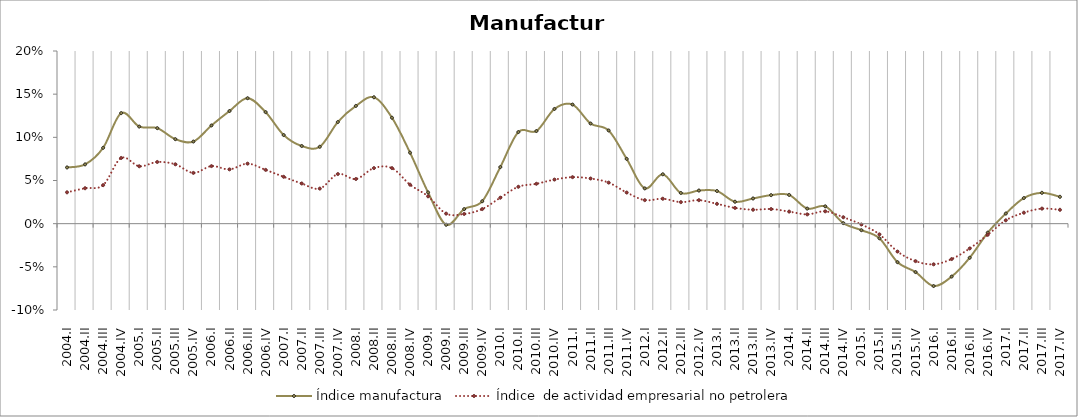
| Category | Índice manufactura | Índice  de actividad empresarial no petrolera |
|---|---|---|
| 2004.I | 0.065 | 0.036 |
| 2004.II | 0.069 | 0.041 |
| 2004.III | 0.088 | 0.045 |
| 2004.IV | 0.128 | 0.076 |
| 2005.I | 0.112 | 0.066 |
| 2005.II | 0.111 | 0.071 |
| 2005.III | 0.098 | 0.069 |
| 2005.IV | 0.095 | 0.059 |
| 2006.I | 0.114 | 0.067 |
| 2006.II | 0.13 | 0.063 |
| 2006.III | 0.145 | 0.07 |
| 2006.IV | 0.129 | 0.062 |
| 2007.I | 0.103 | 0.054 |
| 2007.II | 0.09 | 0.047 |
| 2007.III | 0.089 | 0.041 |
| 2007.IV | 0.118 | 0.057 |
| 2008.I | 0.136 | 0.052 |
| 2008.II | 0.146 | 0.064 |
| 2008.III | 0.123 | 0.064 |
| 2008.IV | 0.082 | 0.045 |
| 2009.I | 0.036 | 0.032 |
| 2009.II | -0.001 | 0.012 |
| 2009.III | 0.017 | 0.011 |
| 2009.IV | 0.026 | 0.017 |
| 2010.I | 0.066 | 0.03 |
| 2010.II | 0.106 | 0.043 |
| 2010.III | 0.107 | 0.046 |
| 2010.IV | 0.133 | 0.051 |
| 2011.I | 0.138 | 0.054 |
| 2011.II | 0.116 | 0.052 |
| 2011.III | 0.108 | 0.048 |
| 2011.IV | 0.075 | 0.036 |
| 2012.I | 0.041 | 0.027 |
| 2012.II | 0.057 | 0.029 |
| 2012.III | 0.036 | 0.025 |
| 2012.IV | 0.038 | 0.027 |
| 2013.I | 0.038 | 0.023 |
| 2013.II | 0.025 | 0.018 |
| 2013.III | 0.029 | 0.016 |
| 2013.IV | 0.033 | 0.017 |
| 2014.I | 0.033 | 0.014 |
| 2014.II | 0.017 | 0.011 |
| 2014.III | 0.02 | 0.014 |
| 2014.IV | 0.001 | 0.007 |
| 2015.I | -0.008 | -0.001 |
| 2015.II | -0.017 | -0.012 |
| 2015.III | -0.045 | -0.032 |
| 2015.IV | -0.056 | -0.043 |
| 2016.I | -0.072 | -0.047 |
| 2016.II | -0.061 | -0.041 |
| 2016.III | -0.039 | -0.029 |
| 2016.IV | -0.01 | -0.013 |
| 2017.I | 0.012 | 0.004 |
| 2017.II | 0.03 | 0.013 |
| 2017.III | 0.036 | 0.017 |
| 2017.IV | 0.031 | 0.016 |